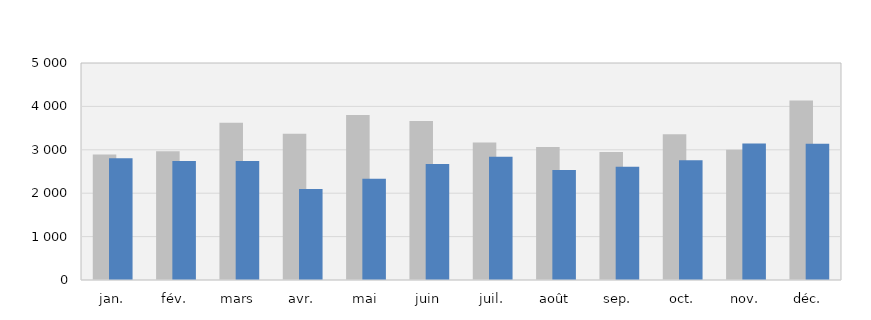
| Category | 2019 | 2020 |
|---|---|---|
| jan. | 2894 | 2804 |
| fév. | 2967 | 2744 |
| mars | 3626 | 2744 |
| avr. | 3367 | 2097 |
| mai | 3802 | 2333 |
| juin | 3661 | 2674 |
| juil. | 3171 | 2839 |
| août | 3067 | 2537 |
| sep. | 2950 | 2612 |
| oct. | 3361 | 2759 |
| nov. | 3004 | 3146 |
| déc. | 4138 | 3141 |